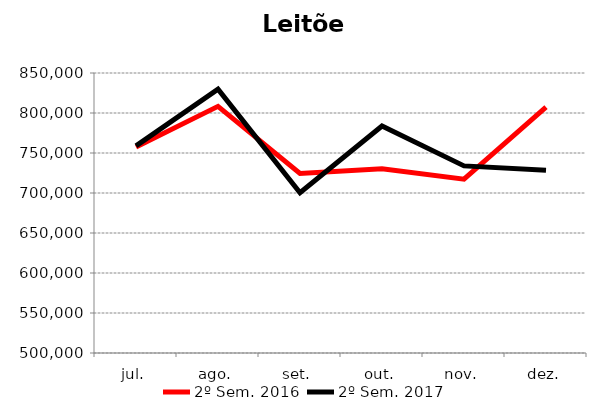
| Category | 2º Sem. 2016 | 2º Sem. 2017 |
|---|---|---|
| jul. | 757358 | 758964 |
| ago. | 808278 | 829871 |
| set. | 724524 | 700334 |
| out. | 730211 | 783784 |
| nov. | 717240 | 733889 |
| dez. | 807355 | 728464 |